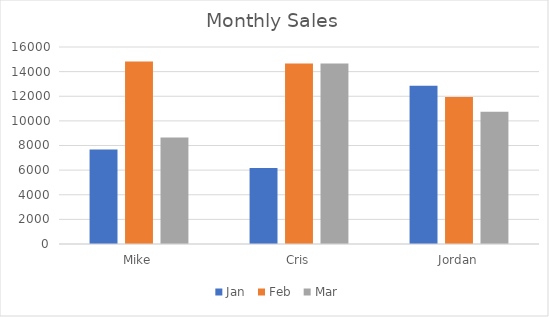
| Category | Jan | Feb | Mar |
|---|---|---|---|
| Mike | 7673 | 14828 | 8658 |
| Cris | 6164 | 14663 | 14657 |
| Jordan | 12844 | 11934 | 10746 |